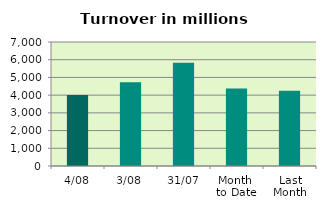
| Category | Series 0 |
|---|---|
| 4/08 | 4014.627 |
| 3/08 | 4726.164 |
| 31/07 | 5824.284 |
| Month 
to Date | 4370.396 |
| Last
Month | 4246.231 |